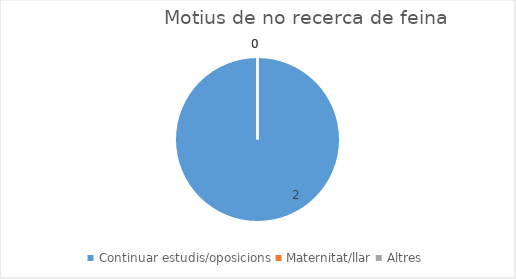
| Category | Series 0 |
|---|---|
| Continuar estudis/oposicions | 2 |
| Maternitat/llar | 0 |
| Altres | 0 |